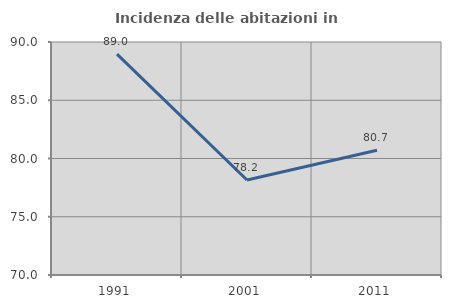
| Category | Incidenza delle abitazioni in proprietà  |
|---|---|
| 1991.0 | 88.966 |
| 2001.0 | 78.154 |
| 2011.0 | 80.712 |